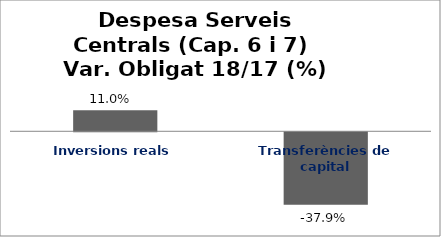
| Category | Series 0 |
|---|---|
| Inversions reals | 0.11 |
| Transferències de capital | -0.379 |